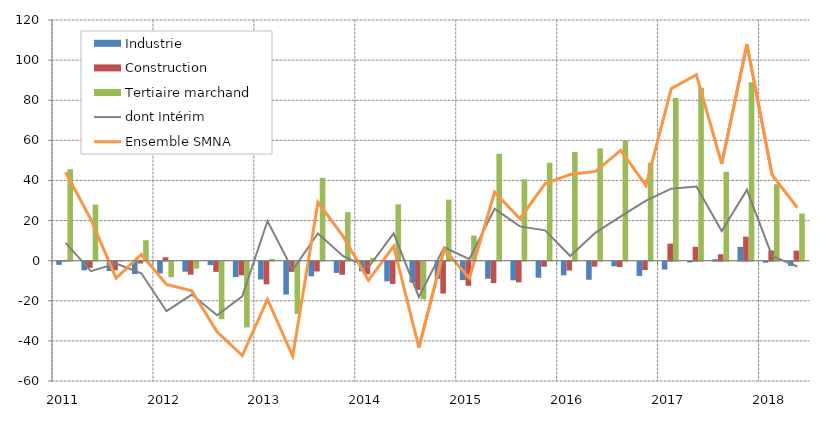
| Category | Industrie | Construction | Tertiaire marchand |
|---|---|---|---|
| 0 | -1.6 | 0.1 | 45.6 |
| 1 | -4.3 | -3.1 | 28 |
| 2 | -4.7 | -4.3 | 0.3 |
| 3 | -6.2 | -0.9 | 10.2 |
| 4 | -5.9 | 1.7 | -7.7 |
| 5 | -5 | -6.5 | -3.5 |
| 6 | -1.7 | -5.1 | -28.7 |
| 7 | -7.7 | -6.8 | -32.8 |
| 8 | -8.9 | -11.3 | 0.9 |
| 9 | -16.4 | -5.1 | -26.1 |
| 10 | -7.3 | -4.9 | 41.3 |
| 11 | -5.6 | -6.5 | 24.2 |
| 12 | -4.8 | -6.3 | 1.3 |
| 13 | -9.8 | -11.1 | 28.1 |
| 14 | -10.5 | -14.1 | -18.8 |
| 15 | -8.7 | -15.9 | 30.4 |
| 16 | -9.2 | -12 | 12.5 |
| 17 | -8.5 | -10.7 | 53.3 |
| 18 | -9.3 | -10.3 | 40.6 |
| 19 | -8 | -2.5 | 48.8 |
| 20 | -6.8 | -4.4 | 54.2 |
| 21 | -9 | -2.5 | 56 |
| 22 | -2.3 | -2.7 | 60 |
| 23 | -7.1 | -4.2 | 48.8 |
| 24 | -3.9 | 8.5 | 81.1 |
| 25 | -0.4 | 6.9 | 86.2 |
| 26 | 0.7 | 3.2 | 44.3 |
| 27 | 6.9 | 12 | 89 |
| 28 | -0.5 | 5.1 | 38.1 |
| 29 | -2.1 | 5 | 23.5 |